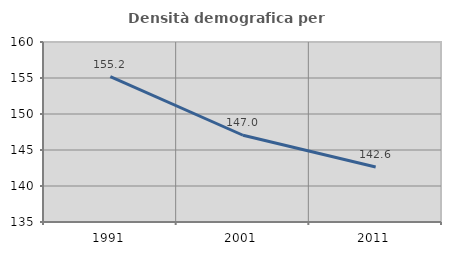
| Category | Densità demografica |
|---|---|
| 1991.0 | 155.178 |
| 2001.0 | 147.048 |
| 2011.0 | 142.643 |